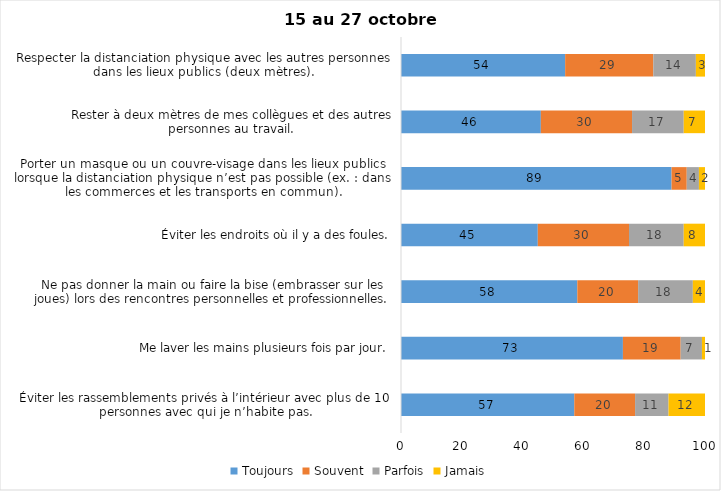
| Category | Toujours | Souvent | Parfois | Jamais |
|---|---|---|---|---|
| Éviter les rassemblements privés à l’intérieur avec plus de 10 personnes avec qui je n’habite pas. | 57 | 20 | 11 | 12 |
| Me laver les mains plusieurs fois par jour. | 73 | 19 | 7 | 1 |
| Ne pas donner la main ou faire la bise (embrasser sur les joues) lors des rencontres personnelles et professionnelles. | 58 | 20 | 18 | 4 |
| Éviter les endroits où il y a des foules. | 45 | 30 | 18 | 8 |
| Porter un masque ou un couvre-visage dans les lieux publics lorsque la distanciation physique n’est pas possible (ex. : dans les commerces et les transports en commun). | 89 | 5 | 4 | 2 |
| Rester à deux mètres de mes collègues et des autres personnes au travail. | 46 | 30 | 17 | 7 |
| Respecter la distanciation physique avec les autres personnes dans les lieux publics (deux mètres). | 54 | 29 | 14 | 3 |